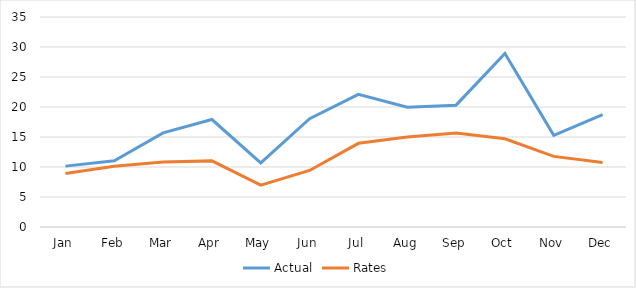
| Category | Actual | Rates |
|---|---|---|
| Jan | 10.146 | 8.901 |
| Feb | 11.043 | 10.11 |
| Mar | 15.687 | 10.813 |
| Apr | 17.911 | 11.019 |
| May | 10.687 | 6.972 |
| Jun | 18.044 | 9.421 |
| Jul | 22.104 | 13.946 |
| Aug | 19.974 | 14.983 |
| Sep | 20.308 | 15.675 |
| Oct | 28.914 | 14.695 |
| Nov | 15.274 | 11.773 |
| Dec | 18.719 | 10.745 |